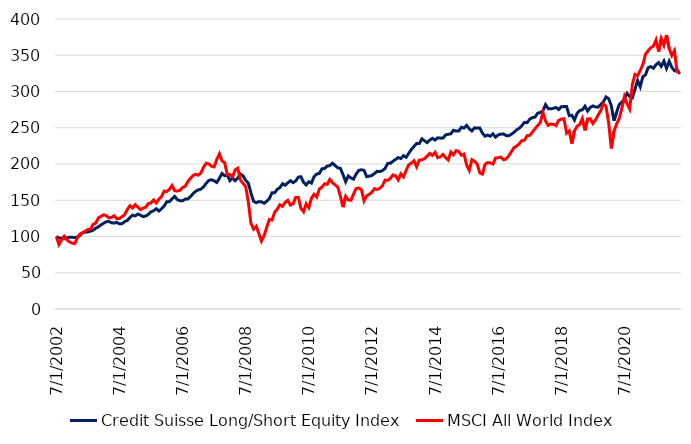
| Category | Credit Suisse Long/Short Equity Index | MSCI All World Index |
|---|---|---|
| 7/31/02 | 100 | 100 |
| 8/31/02 | 98.021 | 88.94 |
| 9/30/02 | 97.561 | 95.37 |
| 10/31/02 | 97.642 | 100.44 |
| 11/30/02 | 98.202 | 95.53 |
| 12/31/02 | 98.946 | 92.64 |
| 1/31/03 | 98.876 | 90.88 |
| 2/28/03 | 98.666 | 90.22 |
| 3/31/03 | 99.086 | 98.01 |
| 4/30/03 | 101.5 | 103.41 |
| 5/31/03 | 105.236 | 105.18 |
| 6/30/03 | 106.065 | 107.37 |
| 7/31/03 | 106.352 | 109.7 |
| 8/31/03 | 107.454 | 110.22 |
| 9/30/03 | 108.758 | 116.78 |
| 10/31/03 | 111.429 | 118.37 |
| 11/30/03 | 113.319 | 125.73 |
| 12/31/03 | 116.035 | 127.77 |
| 1/31/04 | 118.352 | 129.93 |
| 2/29/04 | 120.423 | 128.89 |
| 3/31/04 | 120.666 | 125.63 |
| 4/30/04 | 118.971 | 126.31 |
| 5/31/04 | 118.54 | 128.62 |
| 6/30/04 | 119.318 | 124.39 |
| 7/31/04 | 117.623 | 124.92 |
| 8/31/04 | 117.726 | 127.36 |
| 9/30/04 | 120.504 | 130.37 |
| 10/31/04 | 122.243 | 137.27 |
| 11/30/04 | 126.204 | 142.45 |
| 12/31/04 | 129.454 | 139.34 |
| 1/31/05 | 128.367 | 143.94 |
| 2/28/05 | 130.975 | 140.44 |
| 3/31/05 | 129.483 | 137.04 |
| 4/30/05 | 127.479 | 139.22 |
| 5/31/05 | 128.124 | 140.41 |
| 6/30/05 | 130.57 | 145.48 |
| 7/31/05 | 134.063 | 146.3 |
| 8/31/05 | 135.57 | 150.5 |
| 9/30/05 | 138.311 | 146.36 |
| 10/31/05 | 135.146 | 151.42 |
| 11/30/05 | 138.149 | 155.02 |
| 12/31/05 | 141.988 | 162.55 |
| 1/31/06 | 147.92 | 162.09 |
| 2/28/06 | 148.126 | 165.12 |
| 3/31/06 | 151.756 | 170.32 |
| 4/30/06 | 155.304 | 163.09 |
| 5/31/06 | 150.897 | 162.77 |
| 6/30/06 | 149.372 | 163.74 |
| 7/31/06 | 149.298 | 167.63 |
| 8/31/06 | 151.597 | 169.37 |
| 9/30/06 | 151.726 | 175.61 |
| 10/31/06 | 155.053 | 180.26 |
| 11/30/06 | 159.091 | 184.14 |
| 12/31/06 | 162.404 | 185.85 |
| 1/31/07 | 164.276 | 184.64 |
| 2/28/07 | 165.44 | 187.9 |
| 3/31/07 | 168.531 | 195.83 |
| 4/30/07 | 173.424 | 201.03 |
| 5/31/07 | 177.429 | 200.17 |
| 6/30/07 | 178.166 | 196.94 |
| 7/31/07 | 176.943 | 196.01 |
| 8/31/07 | 174.504 | 206.24 |
| 9/30/07 | 180.281 | 214.1 |
| 10/31/07 | 187.012 | 204.33 |
| 11/30/07 | 183.81 | 201.9 |
| 12/31/07 | 184.584 | 185.22 |
| 1/31/08 | 177.101 | 185.46 |
| 2/29/08 | 180.741 | 182.24 |
| 3/31/08 | 177.013 | 191.91 |
| 4/30/08 | 180.907 | 194.14 |
| 5/31/08 | 186.18 | 177.94 |
| 6/30/08 | 183.704 | 173.11 |
| 7/31/08 | 177.4 | 169.03 |
| 8/31/08 | 173.649 | 147.59 |
| 9/30/08 | 160.079 | 118.21 |
| 10/31/08 | 148.661 | 110.17 |
| 11/30/08 | 146.56 | 113.99 |
| 12/31/08 | 148.108 | 104.15 |
| 1/31/09 | 147.85 | 93.71 |
| 2/28/09 | 145.875 | 101.16 |
| 3/31/09 | 148.583 | 112.77 |
| 4/30/09 | 152.36 | 123.51 |
| 5/31/09 | 160.333 | 122.62 |
| 6/30/09 | 160.274 | 133.25 |
| 7/31/09 | 165.071 | 137.74 |
| 8/31/09 | 167.407 | 143.81 |
| 9/30/09 | 172.812 | 141.49 |
| 10/31/09 | 170.72 | 147.03 |
| 11/30/09 | 173.995 | 149.92 |
| 12/31/09 | 176.939 | 143.36 |
| 1/31/10 | 174.286 | 144.95 |
| 2/28/10 | 176.589 | 153.91 |
| 3/31/10 | 181.876 | 153.88 |
| 4/30/10 | 182.399 | 138.77 |
| 5/31/10 | 174.868 | 134.31 |
| 6/30/10 | 171.246 | 145.07 |
| 7/31/10 | 175.576 | 139.72 |
| 8/31/10 | 173.612 | 152.79 |
| 9/30/10 | 182.455 | 158.19 |
| 10/31/10 | 186.11 | 154.4 |
| 11/30/10 | 186.961 | 165.54 |
| 12/31/10 | 193.357 | 168.02 |
| 1/31/11 | 193.873 | 172.64 |
| 2/28/11 | 197.207 | 172.05 |
| 3/31/11 | 197.767 | 178.69 |
| 4/30/11 | 201.131 | 174.19 |
| 5/31/11 | 197.756 | 171.14 |
| 6/30/11 | 194.816 | 168.18 |
| 7/31/11 | 194.016 | 155.52 |
| 8/31/11 | 185.395 | 140.51 |
| 9/30/11 | 175.716 | 155.41 |
| 10/31/11 | 183.542 | 150.43 |
| 11/30/11 | 180.826 | 149.96 |
| 12/31/11 | 179.227 | 158.54 |
| 1/31/12 | 186.231 | 166.19 |
| 2/29/12 | 191.154 | 166.88 |
| 3/31/12 | 192.112 | 164.56 |
| 4/30/12 | 191.22 | 149.19 |
| 5/31/12 | 182.565 | 156.27 |
| 6/30/12 | 183.195 | 158.22 |
| 7/31/12 | 184.201 | 161.29 |
| 8/31/12 | 186.99 | 166.01 |
| 9/30/12 | 189.927 | 164.76 |
| 10/31/12 | 189.532 | 166.54 |
| 11/30/12 | 190.914 | 170.1 |
| 12/31/12 | 193.935 | 177.79 |
| 1/31/13 | 200.807 | 177.45 |
| 2/28/13 | 201.046 | 180.27 |
| 3/31/13 | 203.824 | 184.96 |
| 4/30/13 | 206.389 | 183.84 |
| 5/31/13 | 208.846 | 178.15 |
| 6/30/13 | 207.538 | 186.5 |
| 7/31/13 | 211.591 | 182.24 |
| 8/31/13 | 209.233 | 191.29 |
| 9/30/13 | 214.756 | 198.82 |
| 10/31/13 | 220.22 | 201.3 |
| 11/30/13 | 224.292 | 204.55 |
| 12/31/13 | 228.33 | 196.22 |
| 1/31/14 | 228.153 | 205.34 |
| 2/28/14 | 234.726 | 205.79 |
| 3/31/14 | 231.941 | 207.32 |
| 4/30/14 | 229.557 | 211.05 |
| 5/31/14 | 233.013 | 214.66 |
| 6/30/14 | 235.36 | 211.81 |
| 7/31/14 | 233.086 | 216.07 |
| 8/31/14 | 236.104 | 208.71 |
| 9/30/14 | 235.684 | 210.01 |
| 10/31/14 | 235.699 | 213.2 |
| 11/30/14 | 240.146 | 208.84 |
| 12/31/14 | 240.993 | 205.44 |
| 1/31/15 | 241.679 | 216.53 |
| 2/28/15 | 246.48 | 212.67 |
| 3/31/15 | 245.433 | 218.44 |
| 4/30/15 | 245.396 | 217.55 |
| 5/31/15 | 250.669 | 212.04 |
| 6/30/15 | 249.512 | 213.68 |
| 7/31/15 | 253.303 | 198.63 |
| 8/31/15 | 248.458 | 191.08 |
| 9/30/15 | 245.673 | 205.9 |
| 10/31/15 | 249.891 | 203.88 |
| 11/30/15 | 249.586 | 199.95 |
| 12/31/15 | 249.56 | 187.76 |
| 1/31/16 | 242.626 | 186.08 |
| 2/29/16 | 238.363 | 199.4 |
| 3/31/16 | 239.962 | 201.94 |
| 4/30/16 | 238.274 | 201.56 |
| 5/31/16 | 241.564 | 199.91 |
| 6/30/16 | 237.047 | 208.33 |
| 7/31/16 | 240.128 | 208.59 |
| 8/31/16 | 241.181 | 209.5 |
| 9/30/16 | 241.498 | 205.78 |
| 10/31/16 | 239.258 | 206.99 |
| 11/30/16 | 238.952 | 211.21 |
| 12/31/16 | 241.004 | 216.86 |
| 1/31/17 | 243.709 | 222.55 |
| 2/28/17 | 247.025 | 224.74 |
| 3/31/17 | 249.339 | 227.89 |
| 4/30/17 | 253.038 | 232.21 |
| 5/31/17 | 257.463 | 232.86 |
| 6/30/17 | 256.969 | 239.11 |
| 7/31/17 | 261.844 | 239.53 |
| 8/31/17 | 264.014 | 243.77 |
| 9/30/17 | 264.659 | 248.65 |
| 10/31/17 | 270.082 | 253.06 |
| 11/30/17 | 271.066 | 256.86 |
| 12/31/17 | 273.324 | 271.2 |
| 1/31/18 | 281.832 | 259.39 |
| 2/28/18 | 276.405 | 253.25 |
| 3/31/18 | 276.08 | 255.19 |
| 4/30/18 | 276.817 | 254.73 |
| 5/31/18 | 277.864 | 252.94 |
| 6/30/18 | 275.119 | 260.26 |
| 7/31/18 | 279.05 | 261.79 |
| 8/31/18 | 279.186 | 262.48 |
| 9/30/18 | 279.345 | 242.61 |
| 10/31/18 | 266.832 | 245.76 |
| 11/30/18 | 267.293 | 228.14 |
| 12/31/18 | 260.705 | 245.93 |
| 1/31/19 | 269.92 | 252.08 |
| 2/28/19 | 273.826 | 254.62 |
| 3/31/19 | 274.647 | 262.77 |
| 4/30/19 | 279.691 | 246.39 |
| 5/31/19 | 273.089 | 262.07 |
| 6/30/19 | 278.07 | 262.53 |
| 7/31/19 | 280.093 | 255.79 |
| 8/31/19 | 278.696 | 260.68 |
| 9/30/19 | 278.35 | 267.57 |
| 10/31/19 | 282.141 | 273.72 |
| 11/30/19 | 285.826 | 283 |
| 12/31/19 | 292.428 | 279.69 |
| 1/31/20 | 290.115 | 256.73 |
| 2/29/20 | 280.55 | 221.47 |
| 3/31/20 | 259.769 | 244.92 |
| 4/30/20 | 270.996 | 255.08 |
| 5/31/20 | 282.053 | 262.81 |
| 6/30/20 | 285.192 | 276.32 |
| 7/31/20 | 289.765 | 292.83 |
| 8/31/20 | 297.487 | 282.96 |
| 9/30/20 | 293.025 | 275.87 |
| 10/31/20 | 291.187 | 309.55 |
| 11/30/20 | 302.848 | 323.57 |
| 12/31/20 | 315.408 | 321.89 |
| 1/31/21 | 306.577 | 329.02 |
| 2/28/21 | 320.522 | 337.1 |
| 3/31/21 | 322.884 | 351.39 |
| 4/30/21 | 332.88 | 356.21 |
| 5/31/21 | 334.28 | 360.47 |
| 6/30/21 | 332.118 | 362.59 |
| 7/31/21 | 336.915 | 371.14 |
| 8/31/21 | 339.895 | 355.23 |
| 9/30/21 | 334.663 | 373.12 |
| 10/31/21 | 342.04 | 363.76 |
| 11/30/21 | 331.834 | 377.93 |
| 12/31/21 | 341.741 | 359.17 |
| 1/31/22 | 333.448 | 349.48 |
| 2/28/22 | 328.632 | 356.26 |
| 3/31/22 | 330.305 | 327.28 |
| 4/30/22 | 324.222 | 326.85 |